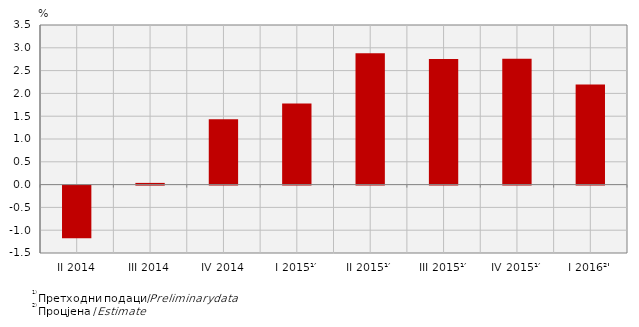
| Category | Стопе реалног раста БДП-а
Real growth rates of GDP |
|---|---|
| II 2014 | -1.153 |
| III 2014 | 0.037 |
| IV 2014 | 1.432 |
| I 2015¹′ | 1.779 |
| II 2015¹′ | 2.878 |
| III 2015¹′ | 2.756 |
| IV 2015¹′ | 2.76 |
| I 2016²' | 2.198 |